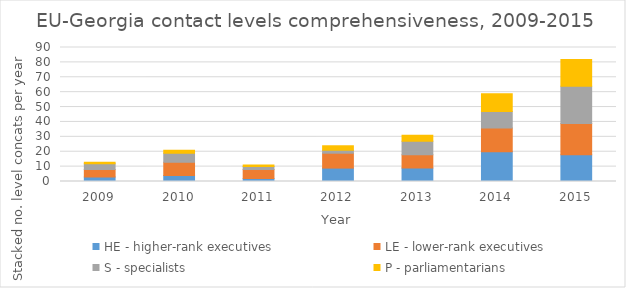
| Category | HE - higher-rank executives | LE - lower-rank executives | S - specialists | P - parliamentarians |
|---|---|---|---|---|
| 2009.0 | 3 | 5 | 4 | 1 |
| 2010.0 | 4 | 9 | 6 | 2 |
| 2011.0 | 2 | 6 | 2 | 1 |
| 2012.0 | 9 | 10 | 2 | 3 |
| 2013.0 | 9 | 9 | 9 | 4 |
| 2014.0 | 20 | 16 | 11 | 12 |
| 2015.0 | 18 | 21 | 25 | 18 |